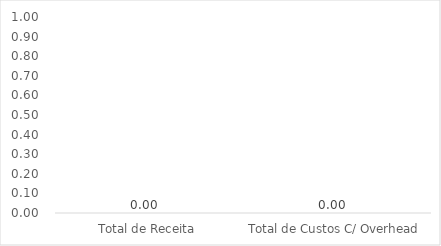
| Category | Series 1 |
|---|---|
| Total de Receita | 0 |
| Total de Custos C/ Overhead | 0 |